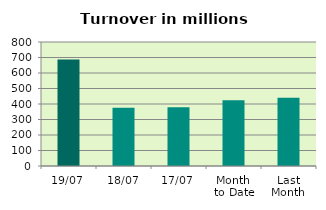
| Category | Series 0 |
|---|---|
| 19/07 | 686.712 |
| 18/07 | 375.984 |
| 17/07 | 379.071 |
| Month 
to Date | 423.865 |
| Last
Month | 439.695 |